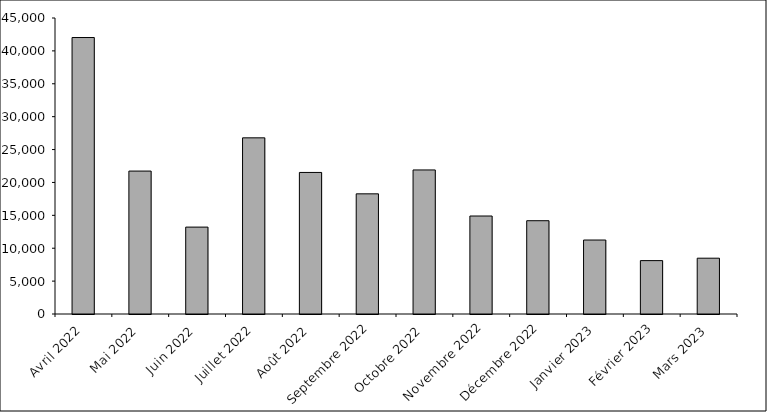
| Category | Series 0 |
|---|---|
| Avril 2022 | 42033 |
| Mai 2022 | 21728 |
| Juin 2022 | 13211 |
| Juillet 2022 | 26781 |
| Août 2022 | 21521 |
| Septembre 2022 | 18269 |
| Octobre 2022 | 21900 |
| Novembre 2022 | 14897 |
| Décembre 2022 | 14183 |
| Janvier 2023 | 11246 |
| Février 2023 | 8116 |
| Mars 2023 | 8484 |